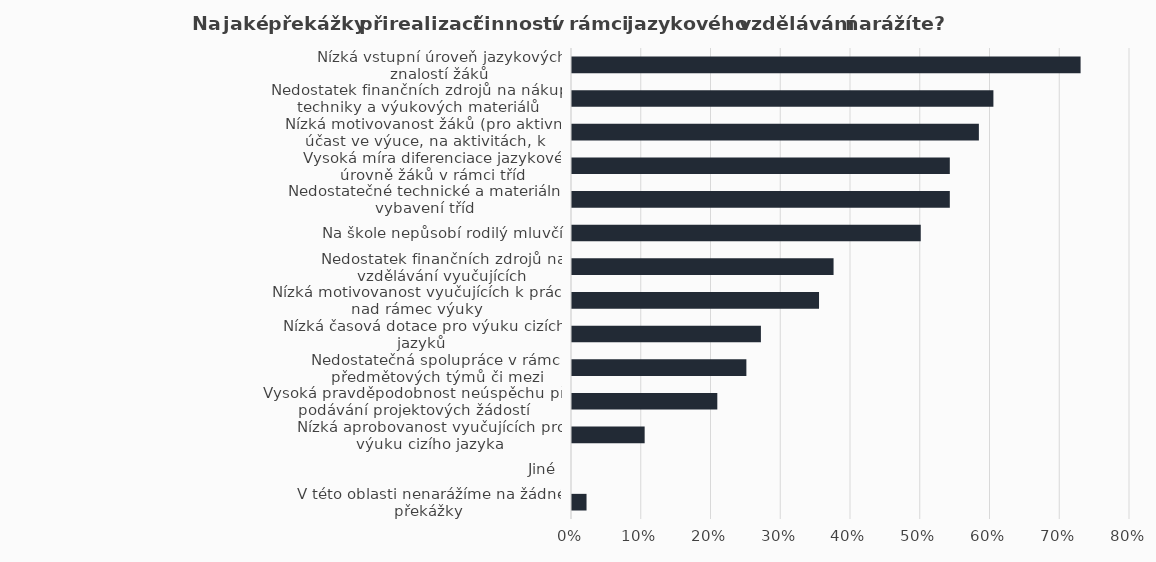
| Category | Series 1 |
|---|---|
| Nízká vstupní úroveň jazykových znalostí žáků | 0.729 |
| Nedostatek finančních zdrojů na nákup techniky a výukových materiálů | 0.604 |
| Nízká motivovanost žáků (pro aktivní účast ve výuce, na aktivitách, k mobilitě) | 0.583 |
| Vysoká míra diferenciace jazykové úrovně žáků v rámci tříd | 0.542 |
| Nedostatečné technické a materiální vybavení tříd | 0.542 |
| Na škole nepůsobí rodilý mluvčí | 0.5 |
| Nedostatek finančních zdrojů na vzdělávání vyučujících | 0.375 |
| Nízká motivovanost vyučujících k práci nad rámec výuky | 0.354 |
| Nízká časová dotace pro výuku cizích jazyků | 0.271 |
| Nedostatečná spolupráce v rámci předmětových týmů či mezi předmětovými týmy | 0.25 |
| Vysoká pravděpodobnost neúspěchu při podávání projektových žádostí | 0.208 |
| Nízká aprobovanost vyučujících pro výuku cizího jazyka | 0.104 |
| Jiné | 0 |
| V této oblasti nenarážíme na žádné překážky | 0.021 |